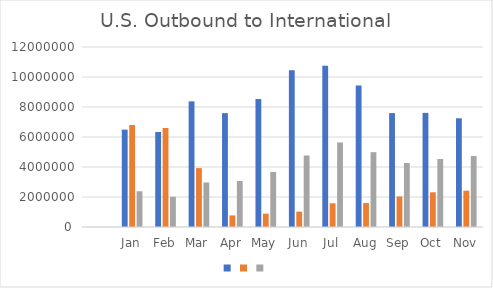
| Category | Series 0 | Series 1 | Series 2 |
|---|---|---|---|
|  | 2019 | 2020 | 2021 |
| Jan | 6489936.806 | 6797079 | 2383889.4 |
| Feb | 6335412.593 | 6601177.9 | 2016559 |
| Mar | 8374670.415 | 3926650 | 2968521.7 |
| Apr | 7592306.487 | 771432 | 3068686.9 |
| May | 8529518.996 | 891525.1 | 3670716.1 |
| Jun | 10444011.047 | 1023999.7 | 4767635.3 |
| Jul | 10745666.698 | 1578370.1 | 5637288.9 |
| Aug | 9438441.923 | 1597311.3 | 4989025.3 |
| Sep | 7593151.729 | 2034545.6 | 4268034.2 |
| Oct | 7608284.785 | 2313216.3 | 4535197.7 |
| Nov | 7247525.379 | 2421041.9 | 4730919.7 |